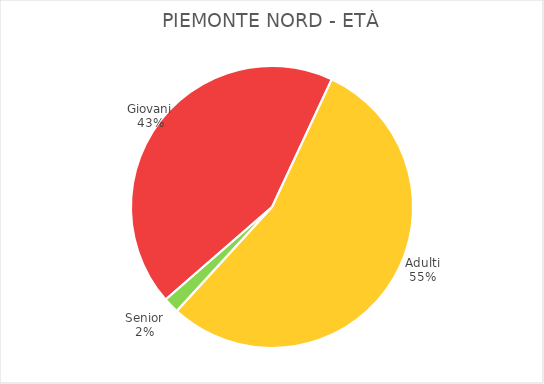
| Category | Piemonte Nord |
|---|---|
| Giovani | 10625 |
| Adulti | 13440 |
| Senior | 444 |